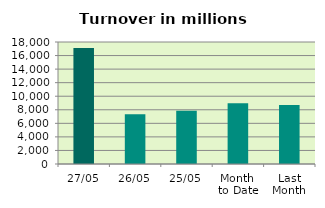
| Category | Series 0 |
|---|---|
| 27/05 | 17103.368 |
| 26/05 | 7330.715 |
| 25/05 | 7856.476 |
| Month 
to Date | 8957.404 |
| Last
Month | 8713.977 |